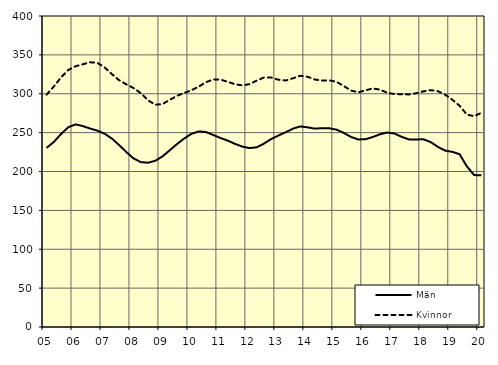
| Category | Män | Kvinnor |
|---|---|---|
| 5.0 | 230.38 | 298.92 |
| nan | 238.07 | 309.39 |
| 6.0 | 248.29 | 321.23 |
| 6.0 | 257 | 330.59 |
| 6.0 | 260.6 | 335.44 |
| nan | 258.42 | 337.89 |
| 7.0 | 255.26 | 340.48 |
| 7.0 | 252.61 | 339.7 |
| 7.0 | 248.6 | 333.97 |
| nan | 242.45 | 325.26 |
| 8.0 | 234.06 | 317.43 |
| 8.0 | 225.03 | 312.04 |
| 8.0 | 216.86 | 307.31 |
| nan | 212.04 | 300.73 |
| 9.0 | 211.3 | 291.56 |
| 9.0 | 213.82 | 285.88 |
| 9.0 | 219.46 | 286.8 |
| nan | 227.36 | 292.15 |
| 10.0 | 235.31 | 297.35 |
| 10.0 | 242.51 | 301.05 |
| 10.0 | 248.49 | 304.59 |
| nan | 251.6 | 309.19 |
| 11.0 | 250.74 | 314.9 |
| 11.0 | 246.92 | 318.4 |
| 11.0 | 243.09 | 318.19 |
| nan | 239.69 | 315.36 |
| 12.0 | 235.55 | 312.26 |
| 12.0 | 232.03 | 310.78 |
| 12.0 | 230.16 | 312.37 |
| nan | 231.08 | 316.95 |
| 13.0 | 235.92 | 320.94 |
| 13.0 | 241.8 | 320.85 |
| 13.0 | 246.3 | 318 |
| nan | 250.54 | 317.04 |
| 14.0 | 255.15 | 319.88 |
| 14.0 | 257.97 | 323.12 |
| 14.0 | 256.81 | 321.91 |
| nan | 255.17 | 318.34 |
| 15.0 | 255.67 | 316.99 |
| 15.0 | 255.6 | 317.22 |
| 15.0 | 253.9 | 315.36 |
| nan | 249.68 | 310.06 |
| 16.0 | 244.46 | 304.12 |
| 16.0 | 241.24 | 301.82 |
| 16.0 | 241.46 | 304.35 |
| nan | 244.31 | 306.82 |
| 17.0 | 247.8 | 305.29 |
| 17.0 | 250.18 | 301.36 |
| 17.0 | 248.86 | 299.58 |
| nan | 244.59 | 299.42 |
| 18.0 | 241.28 | 299.12 |
| 18.0 | 241.22 | 300.6 |
| 18.0 | 241.44 | 303.07 |
| nan | 237.82 | 304.62 |
| 19.0 | 231.68 | 303.33 |
| 19.0 | 226.86 | 298.79 |
| 19.0 | 225.27 | 292.27 |
| nan | 222.17 | 284.51 |
| 20.0 | 206.57 | 273.19 |
| 20.0 | 195.37 | 271.12 |
| 20.0 | 195.17 | 275.46 |